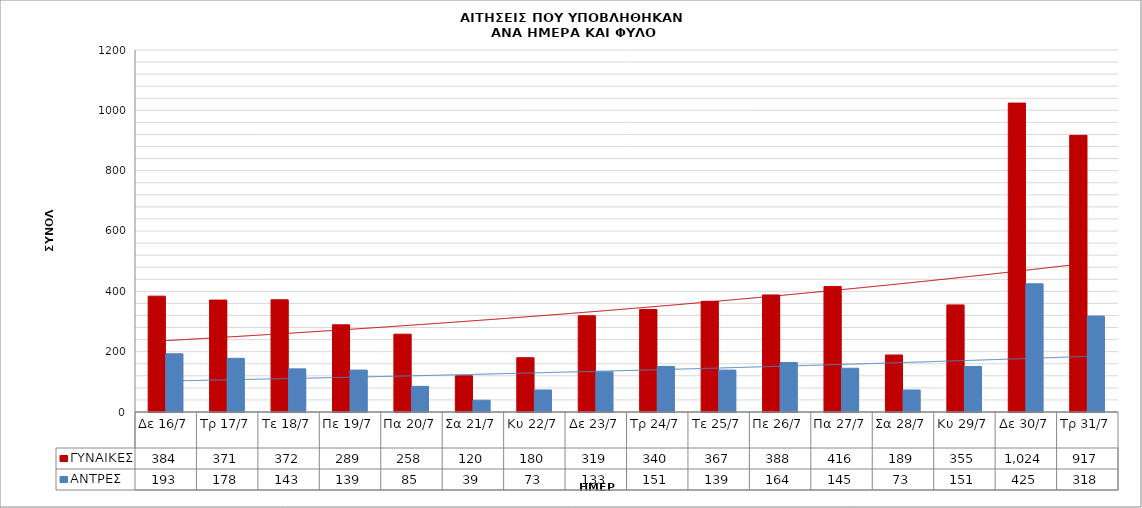
| Category | ΓΥΝΑΙΚΕΣ | ΑΝΤΡΕΣ |
|---|---|---|
| Δε 16/7 | 384 | 193 |
| Τρ 17/7 | 371 | 178 |
| Τε 18/7 | 372 | 143 |
| Πε 19/7 | 289 | 139 |
| Πα 20/7 | 258 | 85 |
| Σα 21/7 | 120 | 39 |
| Κυ 22/7 | 180 | 73 |
| Δε 23/7 | 319 | 133 |
| Τρ 24/7 | 340 | 151 |
| Τε 25/7 | 367 | 139 |
| Πε 26/7 | 388 | 164 |
| Πα 27/7 | 416 | 145 |
| Σα 28/7 | 189 | 73 |
| Κυ 29/7 | 355 | 151 |
| Δε 30/7 | 1024 | 425 |
| Τρ 31/7 | 917 | 318 |